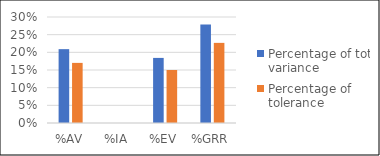
| Category | Percentage of total variance | Percentage of tolerance |
|---|---|---|
| %AV | 0.209 | 0.17 |
| %IA | 0 | 0 |
| %EV | 0.184 | 0.15 |
| %GRR | 0.279 | 0.227 |